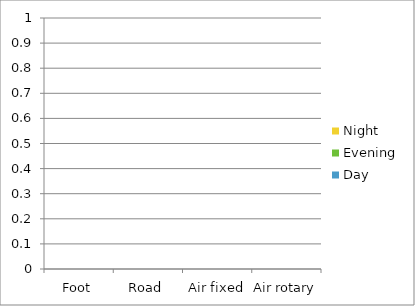
| Category | Day | Evening | Night |
|---|---|---|---|
| Foot | 0 | 0 | 0 |
| Road | 0 | 0 | 0 |
| Air fixed | 0 | 0 | 0 |
| Air rotary | 0 | 0 | 0 |